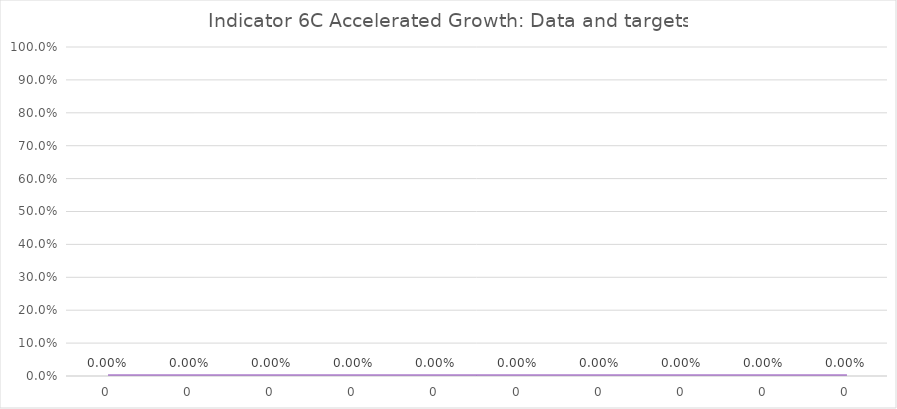
| Category | Indicator 6C data 
and targets |
|---|---|
| 0.0 | 0 |
| 0.0 | 0 |
| 0.0 | 0 |
| 0.0 | 0 |
| 0.0 | 0 |
| 0.0 | 0 |
| 0.0 | 0 |
| 0.0 | 0 |
| 0.0 | 0 |
| 0.0 | 0 |